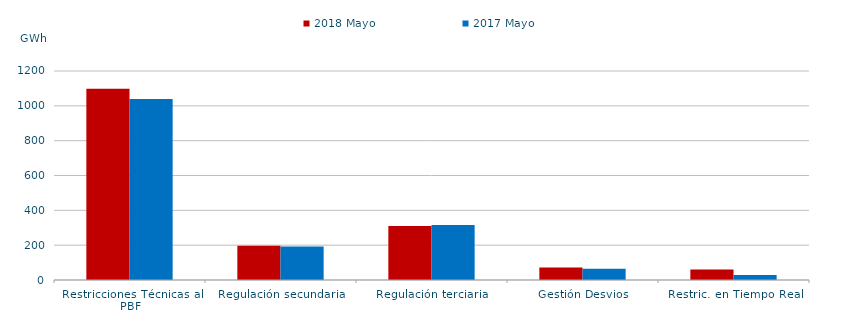
| Category | 2018 | 2017 |
|---|---|---|
| Restricciones Técnicas al PBF | 1097.755 | 1038.656 |
| Regulación secundaria | 196.769 | 191.909 |
| Regulación terciaria | 310.277 | 315.962 |
| Gestión Desvios | 71.841 | 65.169 |
| Restric. en Tiempo Real | 59.98 | 29.116 |